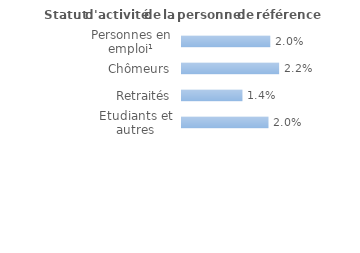
| Category | Series 0 |
|---|---|
| Personnes en emploi¹ | 0.02 |
| Chômeurs | 0.022 |
| Retraités | 0.014 |
| Etudiants et autres inactifs | 0.02 |